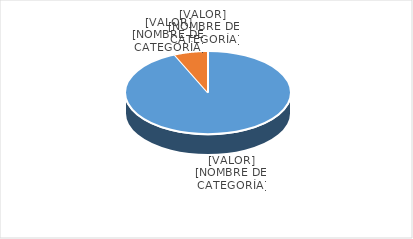
| Category | Series 0 |
|---|---|
| PRESUPUESTO VIGENTE PARA 2024 | 31000000 |
| PRESUPUESTO EJECUTADO  | 2199123.74 |
| PORCENTAJE DE EJECUCIÓN  | 0.071 |